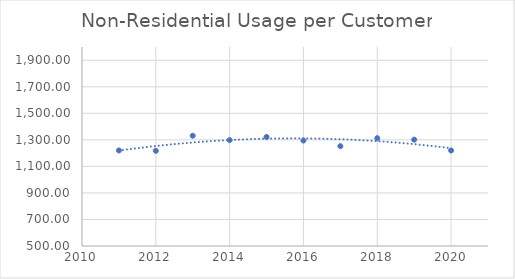
| Category | Series 0 |
|---|---|
| 2020.0 | 1220.091 |
| 2019.0 | 1301.433 |
| 2018.0 | 1312.785 |
| 2017.0 | 1252.577 |
| 2016.0 | 1294.888 |
| 2015.0 | 1321.592 |
| 2014.0 | 1298.371 |
| 2013.0 | 1331.168 |
| 2012.0 | 1217.472 |
| 2011.0 | 1220.193 |